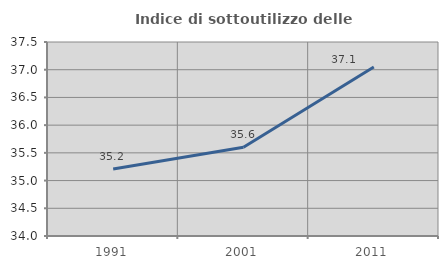
| Category | Indice di sottoutilizzo delle abitazioni  |
|---|---|
| 1991.0 | 35.208 |
| 2001.0 | 35.602 |
| 2011.0 | 37.05 |